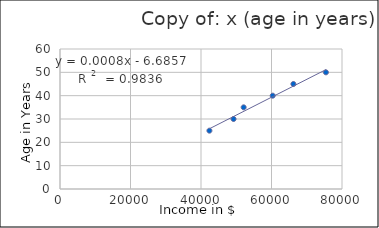
| Category | Copy of: x (age in years) |
|---|---|
| 42388.0 | 25 |
| 49233.0 | 30 |
| 52100.0 | 35 |
| 60344.0 | 40 |
| 66213.0 | 45 |
| 75444.0 | 50 |